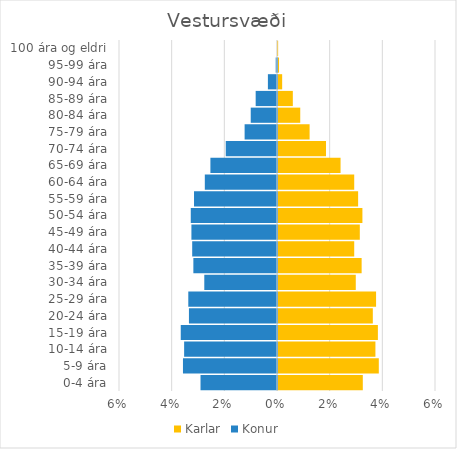
| Category | Karlar | Konur |
|---|---|---|
| 0-4 ára | 0.032 | -0.029 |
| 5-9 ára | 0.038 | -0.036 |
| 10-14 ára | 0.037 | -0.035 |
| 15-19 ára | 0.038 | -0.037 |
| 20-24 ára | 0.036 | -0.033 |
| 25-29 ára | 0.037 | -0.034 |
| 30-34 ára | 0.03 | -0.028 |
| 35-39 ára | 0.032 | -0.032 |
| 40-44 ára | 0.029 | -0.032 |
| 45-49 ára | 0.031 | -0.033 |
| 50-54 ára | 0.032 | -0.033 |
| 55-59 ára | 0.03 | -0.032 |
| 60-64 ára | 0.029 | -0.027 |
| 65-69 ára | 0.024 | -0.025 |
| 70-74 ára | 0.018 | -0.019 |
| 75-79 ára | 0.012 | -0.012 |
| 80-84 ára | 0.008 | -0.01 |
| 85-89 ára | 0.006 | -0.008 |
| 90-94 ára | 0.002 | -0.003 |
| 95-99 ára | 0 | 0 |
| 100 ára og eldri | 0 | 0 |